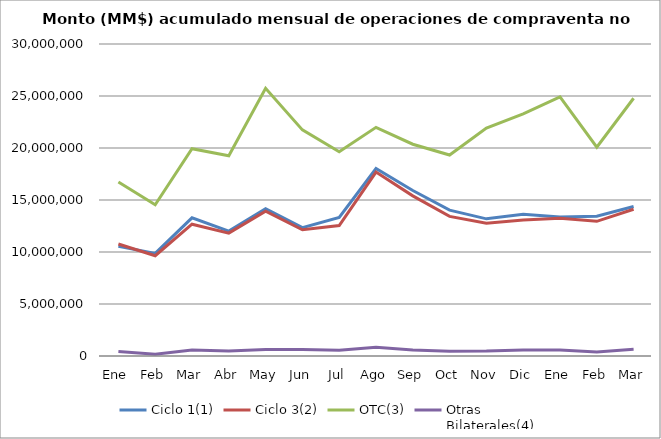
| Category | Ciclo 1(1) | Ciclo 3(2) | OTC(3) | Otras
Bilaterales(4) |
|---|---|---|---|---|
| Ene | 10546788.446 | 10766052.855 | 16733880.464 | 441108.246 |
| Feb | 9865648.605 | 9643015.163 | 14546493.158 | 162828.846 |
| Mar | 13284500.702 | 12671217.696 | 19929559.689 | 579369.626 |
| Abr | 12013284.398 | 11814687.15 | 19251546.959 | 472963.375 |
| May | 14168561.966 | 13923329.027 | 25733408.519 | 633291.784 |
| Jun | 12340302.059 | 12134541.473 | 21740779.901 | 628996.262 |
| Jul | 13325192.123 | 12545118.041 | 19637929.085 | 544511.801 |
| Ago | 18030973.987 | 17687596.998 | 21986660.993 | 842692.021 |
| Sep | 15911017.047 | 15396153.443 | 20361806.772 | 585420.575 |
| Oct | 14024707.977 | 13420544.419 | 19328083.862 | 462712.635 |
| Nov | 13188648.248 | 12772951.51 | 21913468.774 | 469363.683 |
| Dic | 13636796.842 | 13069841.623 | 23282002.87 | 584299.877 |
| Ene | 13368743.504 | 13252582.307 | 24907688.449 | 583765.947 |
| Feb | 13431145.741 | 12946874.395 | 20075396.007 | 377593.299 |
| Mar | 14378352.11 | 14112935.088 | 24782461.824 | 641313.533 |